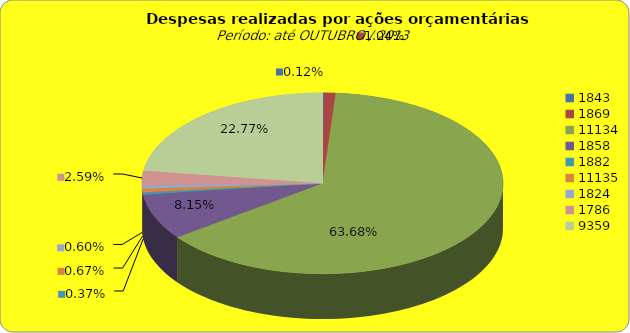
| Category | Series 1 |
|---|---|
| 1843.0 | 161802.31 |
| 1869.0 | 1403546.54 |
| 11134.0 | 85825889.86 |
| 1858.0 | 10989932.01 |
| 1882.0 | 503655.42 |
| 11135.0 | 896512.99 |
| 1824.0 | 806188.23 |
| 1786.0 | 3495312.63 |
| 9359.0 | 30694557.55 |